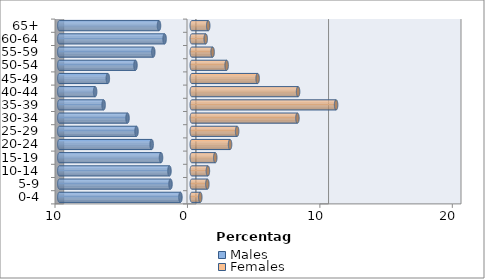
| Category | Males | Females |
|---|---|---|
| 0-4 | -0.857 | 0.642 |
| 5-9 | -1.606 | 1.176 |
| 10-14 | -1.685 | 1.217 |
| 15-19 | -2.323 | 1.772 |
| 20-24 | -3.03 | 2.89 |
| 25-29 | -4.173 | 3.424 |
| 30-34 | -4.852 | 7.978 |
| 35-39 | -6.657 | 10.896 |
| 40-44 | -7.299 | 8.027 |
| 45-49 | -6.338 | 4.972 |
| 50-54 | -4.252 | 2.633 |
| 55-59 | -2.906 | 1.573 |
| 60-64 | -2.053 | 1.052 |
| 65+ | -2.476 | 1.242 |